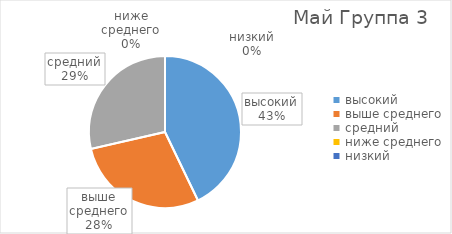
| Category | Series 0 |
|---|---|
| высокий | 3 |
| выше среднего | 2 |
| средний | 2 |
| ниже среднего | 0 |
| низкий | 0 |